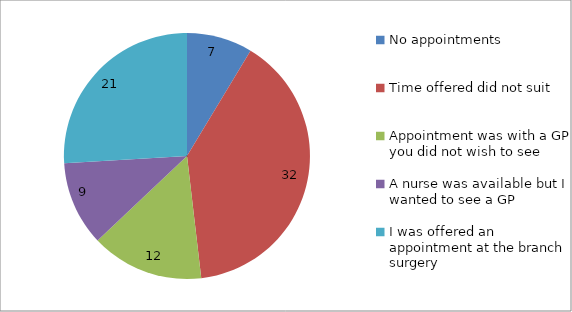
| Category | Series 0 |
|---|---|
| No appointments | 7 |
| Time offered did not suit | 32 |
| Appointment was with a GP you did not wish to see | 12 |
| A nurse was available but I wanted to see a GP | 9 |
| I was offered an appointment at the branch surgery | 21 |